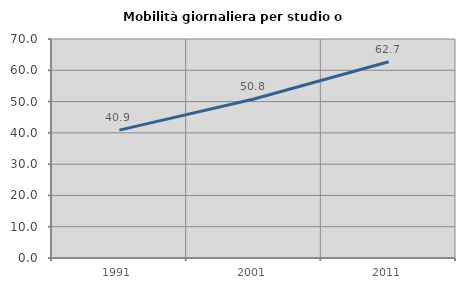
| Category | Mobilità giornaliera per studio o lavoro |
|---|---|
| 1991.0 | 40.875 |
| 2001.0 | 50.831 |
| 2011.0 | 62.737 |